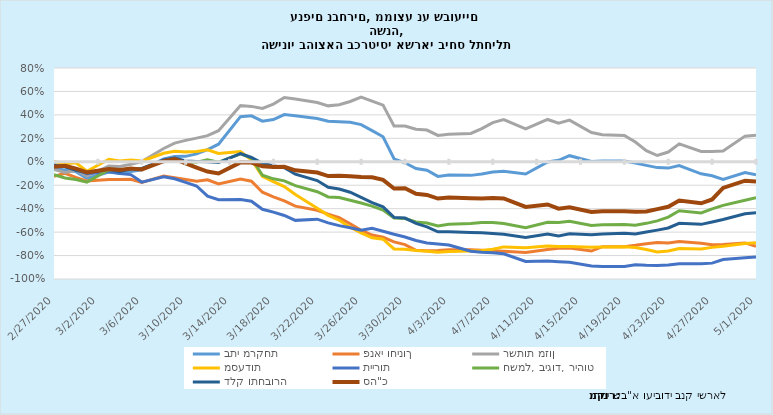
| Category | בתי מרקחת | פנאי וחינוך | רשתות מזון | מסעדות | תיירות | חשמל, ביגוד, ריהוט | דלק ותחבורה  | סה"כ |
|---|---|---|---|---|---|---|---|---|
| 2/27/20 | -0.051 | -0.124 | -0.066 | 0.004 | -0.027 | -0.11 | -0.03 | -0.042 |
| 2/28/20 | -0.073 | -0.099 | -0.09 | -0.017 | -0.04 | -0.138 | -0.043 | -0.034 |
| 2/29/20 | -0.084 | -0.133 | -0.072 | -0.009 | -0.068 | -0.151 | -0.073 | -0.059 |
| 3/1/20 | -0.141 | -0.165 | -0.122 | -0.08 | -0.101 | -0.174 | -0.088 | -0.091 |
| 3/3/20 | -0.088 | -0.151 | -0.036 | 0.022 | -0.083 | -0.068 | -0.063 | -0.061 |
| 3/4/20 | -0.098 | -0.152 | -0.041 | 0.007 | -0.101 | -0.077 | -0.084 | -0.071 |
| 3/5/20 | -0.084 | -0.149 | -0.021 | 0.015 | -0.109 | -0.056 | -0.06 | -0.058 |
| 3/6/20 | -0.069 | -0.176 | 0.001 | 0.006 | -0.173 | -0.061 | -0.057 | -0.065 |
| 3/8/20 | 0.025 | -0.122 | 0.114 | 0.073 | -0.128 | 0.006 | 0.015 | 0.005 |
| 3/9/20 | 0.045 | -0.137 | 0.159 | 0.09 | -0.145 | 0.016 | 0.032 | 0.022 |
| 3/10/20 | 0.046 | -0.151 | 0.183 | 0.084 | -0.176 | -0.006 | 0.008 | -0.013 |
| 3/11/20 | 0.067 | -0.165 | 0.202 | 0.088 | -0.206 | -0.003 | 0.002 | -0.049 |
| 3/12/20 | 0.103 | -0.154 | 0.223 | 0.103 | -0.293 | 0.018 | 0.001 | -0.084 |
| 3/13/20 | 0.15 | -0.189 | 0.265 | 0.071 | -0.323 | -0.003 | -0.007 | -0.1 |
| 3/15/20 | 0.385 | -0.147 | 0.479 | 0.087 | -0.321 | 0.067 | 0.07 | -0.005 |
| 3/16/20 | 0.392 | -0.166 | 0.472 | 0.018 | -0.336 | 0.032 | 0.037 | -0.007 |
| 3/17/20 | 0.346 | -0.26 | 0.454 | -0.124 | -0.405 | -0.115 | -0.014 | -0.039 |
| 3/18/20 | 0.361 | -0.299 | 0.492 | -0.169 | -0.43 | -0.145 | -0.034 | -0.045 |
| 3/19/20 | 0.403 | -0.334 | 0.548 | -0.212 | -0.458 | -0.163 | -0.051 | -0.043 |
| 3/20/20 | 0.393 | -0.378 | 0.535 | -0.279 | -0.5 | -0.204 | -0.106 | -0.073 |
| 3/22/20 | 0.368 | -0.413 | 0.506 | -0.397 | -0.49 | -0.255 | -0.161 | -0.092 |
| 3/23/20 | 0.345 | -0.446 | 0.477 | -0.457 | -0.522 | -0.3 | -0.218 | -0.122 |
| 3/24/20 | 0.342 | -0.476 | 0.487 | -0.499 | -0.545 | -0.305 | -0.232 | -0.12 |
| 3/25/20 | 0.337 | -0.528 | 0.514 | -0.558 | -0.563 | -0.328 | -0.259 | -0.123 |
| 3/26/20 | 0.317 | -0.584 | 0.552 | -0.607 | -0.585 | -0.352 | -0.303 | -0.13 |
| 3/27/20 | 0.266 | -0.625 | 0.517 | -0.648 | -0.567 | -0.378 | -0.348 | -0.133 |
| 3/28/20 | 0.214 | -0.644 | 0.483 | -0.66 | -0.592 | -0.412 | -0.385 | -0.155 |
| 3/29/20 | 0.026 | -0.684 | 0.306 | -0.743 | -0.618 | -0.479 | -0.474 | -0.228 |
| 3/30/20 | -0.009 | -0.706 | 0.305 | -0.746 | -0.641 | -0.484 | -0.48 | -0.226 |
| 3/31/20 | -0.058 | -0.755 | 0.277 | -0.758 | -0.672 | -0.513 | -0.526 | -0.274 |
| 4/1/20 | -0.072 | -0.759 | 0.27 | -0.762 | -0.692 | -0.522 | -0.556 | -0.283 |
| 4/2/20 | -0.125 | -0.757 | 0.225 | -0.771 | -0.702 | -0.547 | -0.598 | -0.314 |
| 4/3/20 | -0.113 | -0.75 | 0.235 | -0.766 | -0.71 | -0.532 | -0.596 | -0.304 |
| 4/5/20 | -0.116 | -0.751 | 0.242 | -0.762 | -0.763 | -0.526 | -0.604 | -0.31 |
| 4/6/20 | -0.104 | -0.754 | 0.283 | -0.757 | -0.772 | -0.517 | -0.606 | -0.314 |
| 4/7/20 | -0.088 | -0.758 | 0.334 | -0.746 | -0.777 | -0.517 | -0.611 | -0.309 |
| 4/8/20 | -0.08 | -0.762 | 0.359 | -0.726 | -0.785 | -0.526 | -0.619 | -0.313 |
| 4/10/20 | -0.104 | -0.773 | 0.281 | -0.734 | -0.85 | -0.562 | -0.645 | -0.385 |
| 4/12/20 | -0.001 | -0.748 | 0.361 | -0.719 | -0.847 | -0.515 | -0.617 | -0.364 |
| 4/13/20 | 0.013 | -0.739 | 0.329 | -0.723 | -0.852 | -0.518 | -0.632 | -0.4 |
| 4/14/20 | 0.052 | -0.735 | 0.355 | -0.723 | -0.856 | -0.507 | -0.615 | -0.388 |
| 4/16/20 | 0.003 | -0.761 | 0.25 | -0.728 | -0.888 | -0.543 | -0.624 | -0.427 |
| 4/17/20 | 0.007 | -0.724 | 0.23 | -0.727 | -0.893 | -0.538 | -0.617 | -0.422 |
| 4/19/20 | 0.006 | -0.725 | 0.225 | -0.725 | -0.894 | -0.535 | -0.611 | -0.422 |
| 4/20/20 | -0.011 | -0.713 | 0.169 | -0.732 | -0.878 | -0.541 | -0.616 | -0.426 |
| 4/21/20 | -0.031 | -0.699 | 0.095 | -0.749 | -0.882 | -0.525 | -0.599 | -0.423 |
| 4/22/20 | -0.05 | -0.689 | 0.054 | -0.769 | -0.885 | -0.504 | -0.583 | -0.404 |
| 4/23/20 | -0.054 | -0.693 | 0.083 | -0.762 | -0.88 | -0.472 | -0.565 | -0.384 |
| 4/24/20 | -0.033 | -0.681 | 0.153 | -0.74 | -0.871 | -0.417 | -0.525 | -0.331 |
| 4/26/20 | -0.103 | -0.696 | 0.088 | -0.744 | -0.87 | -0.437 | -0.534 | -0.354 |
| 4/27/20 | -0.119 | -0.708 | 0.088 | -0.73 | -0.865 | -0.402 | -0.514 | -0.322 |
| 4/28/20 | -0.15 | -0.707 | 0.091 | -0.721 | -0.834 | -0.372 | -0.493 | -0.223 |
| 4/30/20 | -0.092 | -0.692 | 0.219 | -0.697 | -0.819 | -0.328 | -0.443 | -0.162 |
| 5/1/20 | -0.111 | -0.72 | 0.227 | -0.69 | -0.812 | -0.306 | -0.435 | -0.168 |